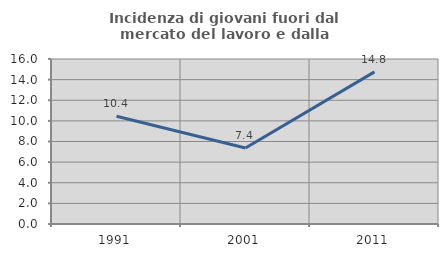
| Category | Incidenza di giovani fuori dal mercato del lavoro e dalla formazione  |
|---|---|
| 1991.0 | 10.448 |
| 2001.0 | 7.368 |
| 2011.0 | 14.754 |